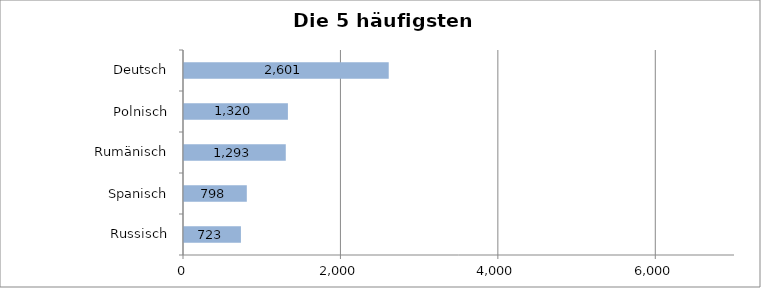
| Category | Series 0 |
|---|---|
| Russisch | 723 |
| Spanisch | 798 |
| Rumänisch | 1293 |
| Polnisch | 1320 |
| Deutsch | 2601 |